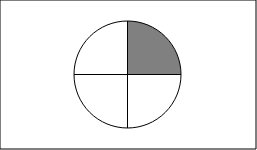
| Category | Series 0 | Series 1 |
|---|---|---|
| 0 | 1 |  |
| 1 | 1 |  |
| 2 | 1 |  |
| 3 | 1 |  |